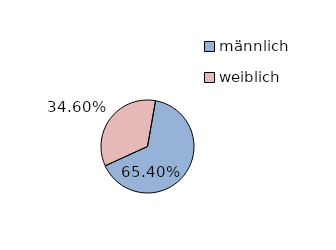
| Category | Series 0 |
|---|---|
| männlich | 65.4 |
| weiblich | 34.6 |